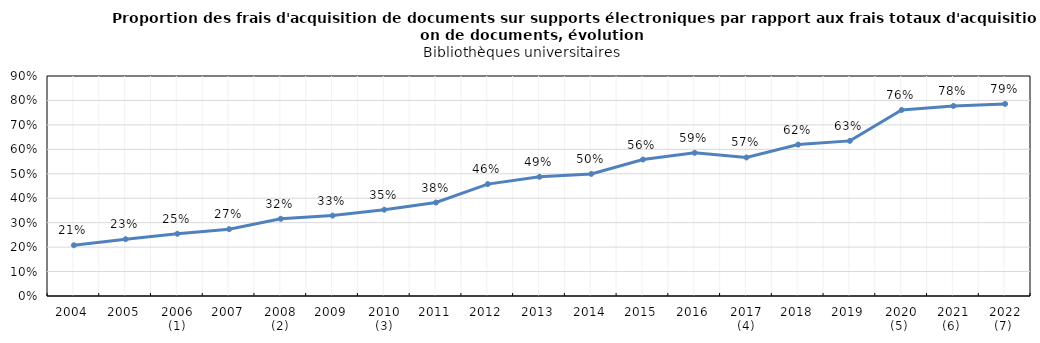
| Category | Series 0 |
|---|---|
| 2004 | 0.208 |
| 2005 | 0.232 |
| 2006 (1) | 0.255 |
| 2007 | 0.273 |
| 2008 (2) | 0.316 |
| 2009 | 0.329 |
| 2010 (3) | 0.353 |
| 2011 | 0.382 |
| 2012 | 0.458 |
| 2013 | 0.488 |
| 2014 | 0.499 |
| 2015 | 0.558 |
| 2016 | 0.586 |
| 2017 (4) | 0.567 |
| 2018 | 0.619 |
| 2019 | 0.635 |
| 2020 (5)  | 0.761 |
| 2021 (6)  | 0.777 |
| 2022 (7)  | 0.786 |